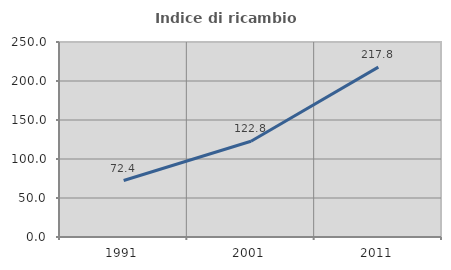
| Category | Indice di ricambio occupazionale  |
|---|---|
| 1991.0 | 72.405 |
| 2001.0 | 122.791 |
| 2011.0 | 217.791 |